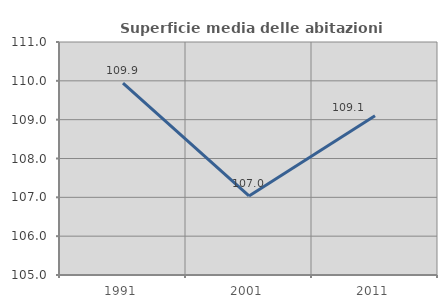
| Category | Superficie media delle abitazioni occupate |
|---|---|
| 1991.0 | 109.941 |
| 2001.0 | 107.036 |
| 2011.0 | 109.101 |